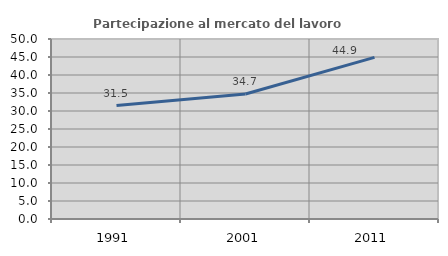
| Category | Partecipazione al mercato del lavoro  femminile |
|---|---|
| 1991.0 | 31.518 |
| 2001.0 | 34.735 |
| 2011.0 | 44.883 |